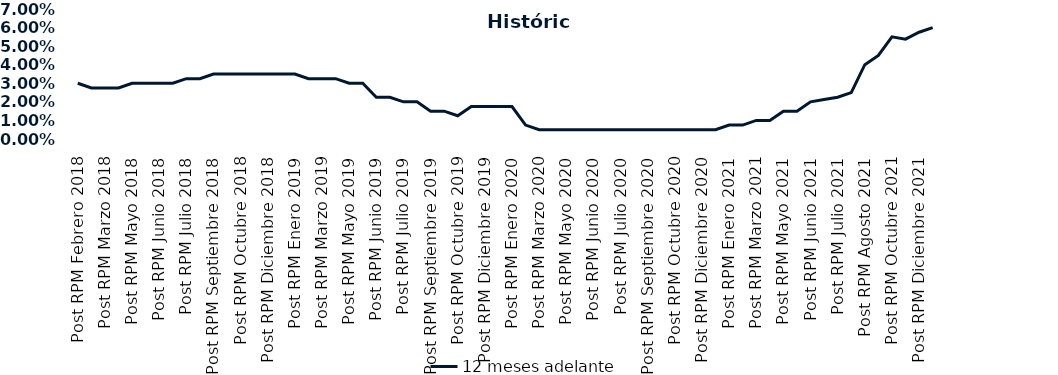
| Category | 12 meses adelante  |
|---|---|
| Post RPM Febrero 2018 | 0.03 |
| Pre RPM Marzo 2018 | 0.028 |
| Post RPM Marzo 2018 | 0.028 |
| Pre RPM Mayo 2018 | 0.028 |
| Post RPM Mayo 2018 | 0.03 |
| Pre RPM Junio 2018 | 0.03 |
| Post RPM Junio 2018 | 0.03 |
| Pre RPM Julio 2018 | 0.03 |
| Post RPM Julio 2018 | 0.032 |
| Pre RPM Septiembre 2018 | 0.032 |
| Post RPM Septiembre 2018 | 0.035 |
| Pre RPM Octubre 2018 | 0.035 |
| Post RPM Octubre 2018 | 0.035 |
| Pre RPM Diciembre 2018 | 0.035 |
| Post RPM Diciembre 2018 | 0.035 |
| Pre RPM Enero 2019 | 0.035 |
| Post RPM Enero 2019 | 0.035 |
| Pre RPM Marzo 2019 | 0.032 |
| Post RPM Marzo 2019 | 0.032 |
| Pre RPM Mayo 2019 | 0.032 |
| Post RPM Mayo 2019 | 0.03 |
| Pre RPM Junio 2019 | 0.03 |
| Post RPM Junio 2019 | 0.022 |
| Pre RPM Julio 2019 | 0.022 |
| Post RPM Julio 2019 | 0.02 |
| Pre RPM Septiembre 2019 | 0.02 |
| Post RPM Septiembre 2019 | 0.015 |
| Pre RPM Octubre 2019 | 0.015 |
| Post RPM Octubre 2019 | 0.012 |
| Pre RPM Diciembre 2019 | 0.018 |
| Post RPM Diciembre 2019 | 0.018 |
| Pre RPM Enero 2020 | 0.018 |
| Post RPM Enero 2020 | 0.018 |
| Pre RPM Marzo 2020 | 0.008 |
| Post RPM Marzo 2020 | 0.005 |
| Pre RPM Mayo 2020 | 0.005 |
| Post RPM Mayo 2020 | 0.005 |
| Pre RPM Junio 2020 | 0.005 |
| Post RPM Junio 2020 | 0.005 |
| Pre RPM Julio 2020 | 0.005 |
| Post RPM Julio 2020 | 0.005 |
| Pre RPM Septiembre 2020 | 0.005 |
| Post RPM Septiembre 2020 | 0.005 |
| Pre RPM Octubre 2020 | 0.005 |
| Post RPM Octubre 2020 | 0.005 |
| Pre RPM Diciembre 2020 | 0.005 |
| Post RPM Diciembre 2020 | 0.005 |
| Pre RPM Enero 2021 | 0.005 |
| Post RPM Enero 2021 | 0.008 |
| Pre RPM Marzo 2021 | 0.008 |
| Post RPM Marzo 2021 | 0.01 |
| Pre RPM Mayo 2021 | 0.01 |
| Post RPM Mayo 2021 | 0.015 |
| Pre RPM Junio 2021 | 0.015 |
| Post RPM Junio 2021 | 0.02 |
| Pre RPM Julio 2021 | 0.021 |
| Post RPM Julio 2021 | 0.022 |
| Pre RPM Agosto 2021 | 0.025 |
| Post RPM Agosto 2021 | 0.04 |
| Pre RPM Octubre 2021 | 0.045 |
| Post RPM Octubre 2021 | 0.055 |
| Pre RPM Diciembre 2021 | 0.054 |
| Post RPM Diciembre 2021 | 0.058 |
| Pre RPM Enero 2022 | 0.06 |